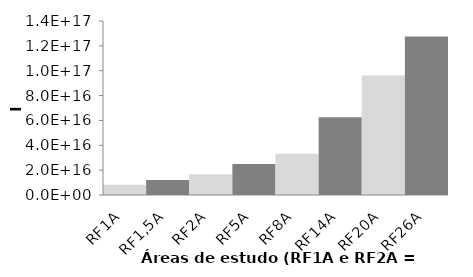
| Category | Series 0 |
|---|---|
| RF1A | 8257183650655123 |
| RF1,5A | 11971261463623440 |
| RF2A | 16769863434382266 |
| RF5A | 24973624013630016 |
| RF8A | 33268772467126248 |
| RF14A | 62627815787938120 |
| RF20A | 96105657535412656 |
| RF26A | 127540569734803248 |